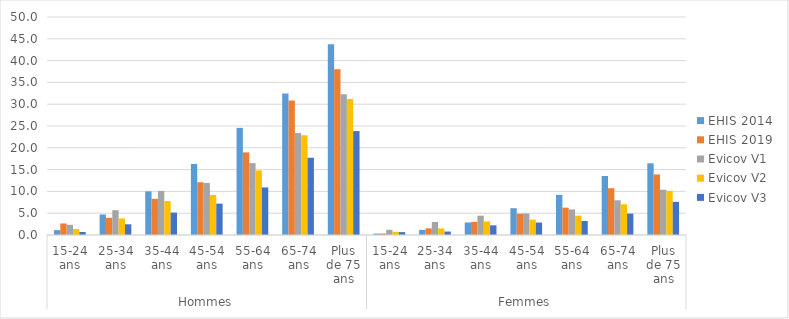
| Category | EHIS 2014 | EHIS 2019 | Evicov V1 | Evicov V2 | Evicov V3 |
|---|---|---|---|---|---|
| 0 | 1.12 | 2.645 | 2.332 | 1.352 | 0.689 |
| 1 | 4.713 | 3.939 | 5.681 | 3.794 | 2.455 |
| 2 | 10.006 | 8.299 | 10.108 | 7.799 | 5.135 |
| 3 | 16.31 | 12.1 | 11.933 | 9.196 | 7.195 |
| 4 | 24.569 | 18.952 | 16.494 | 14.807 | 10.909 |
| 5 | 32.444 | 30.829 | 23.387 | 22.867 | 17.721 |
| 6 | 43.761 | 37.996 | 32.267 | 31.188 | 23.84 |
| 7 | 0.321 | 0.332 | 1.188 | 0.731 | 0.657 |
| 8 | 1.171 | 1.517 | 2.986 | 1.495 | 0.79 |
| 9 | 2.867 | 2.993 | 4.429 | 3.114 | 2.216 |
| 10 | 6.146 | 4.889 | 4.941 | 3.534 | 2.855 |
| 11 | 9.212 | 6.267 | 5.861 | 4.447 | 3.217 |
| 12 | 13.526 | 10.734 | 7.963 | 7.046 | 4.902 |
| 13 | 16.444 | 13.886 | 10.382 | 10.126 | 7.606 |